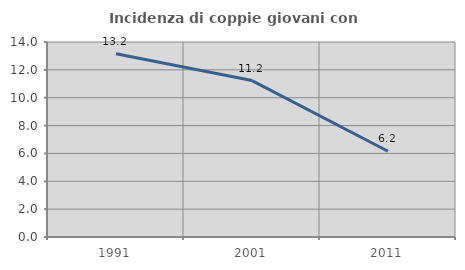
| Category | Incidenza di coppie giovani con figli |
|---|---|
| 1991.0 | 13.154 |
| 2001.0 | 11.229 |
| 2011.0 | 6.156 |